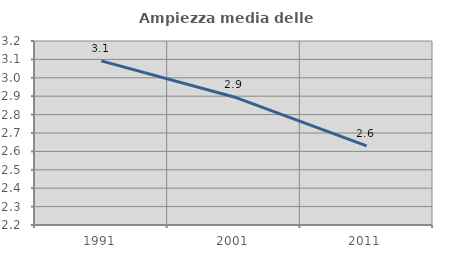
| Category | Ampiezza media delle famiglie |
|---|---|
| 1991.0 | 3.092 |
| 2001.0 | 2.896 |
| 2011.0 | 2.63 |